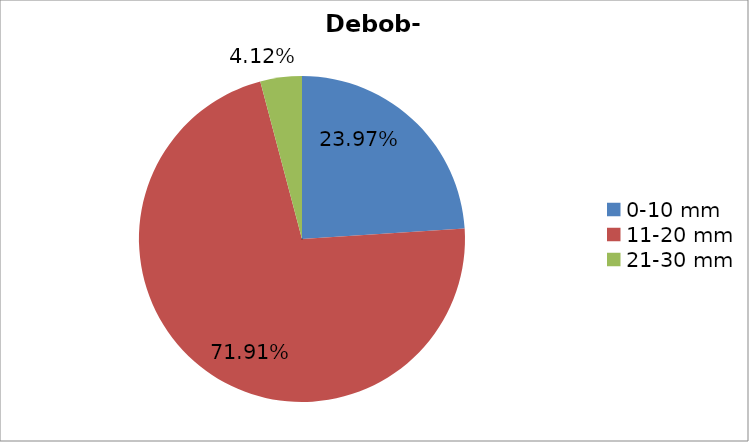
| Category | Series 0 |
|---|---|
| 0-10 mm | 0.24 |
| 11-20 mm | 0.719 |
| 21-30 mm | 0.041 |